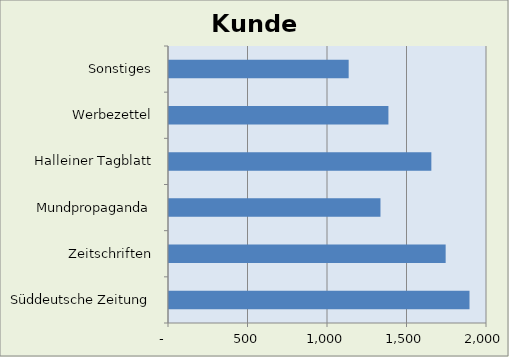
| Category | Kunden |
|---|---|
| Süddeutsche Zeitung | 1890 |
| Zeitschriften | 1740 |
| Mundpropaganda | 1330 |
| Halleiner Tagblatt | 1650 |
| Werbezettel | 1380 |
| Sonstiges | 1130 |